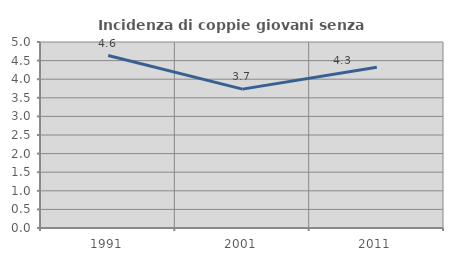
| Category | Incidenza di coppie giovani senza figli |
|---|---|
| 1991.0 | 4.636 |
| 2001.0 | 3.733 |
| 2011.0 | 4.323 |